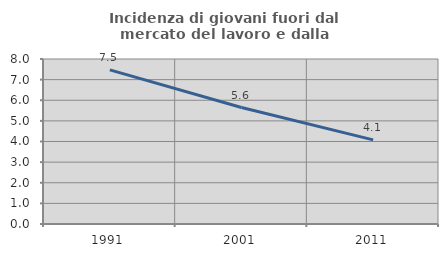
| Category | Incidenza di giovani fuori dal mercato del lavoro e dalla formazione  |
|---|---|
| 1991.0 | 7.473 |
| 2001.0 | 5.647 |
| 2011.0 | 4.077 |